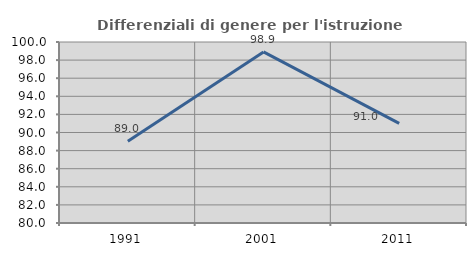
| Category | Differenziali di genere per l'istruzione superiore |
|---|---|
| 1991.0 | 89.046 |
| 2001.0 | 98.903 |
| 2011.0 | 91.008 |